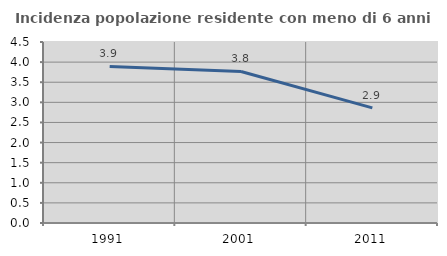
| Category | Incidenza popolazione residente con meno di 6 anni |
|---|---|
| 1991.0 | 3.892 |
| 2001.0 | 3.767 |
| 2011.0 | 2.863 |